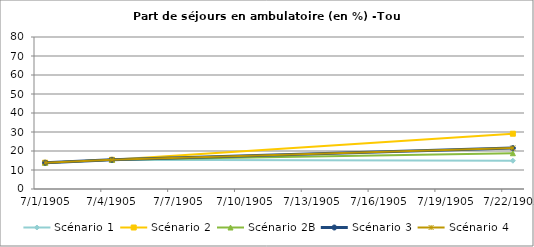
| Category | Scénario 1 | Scénario 2 | Scénario 2B | Scénario 3 | Scénario 4 |
|---|---|---|---|---|---|
| 2009.0 | 13.841 | 13.841 | 13.841 | 13.841 | 13.841 |
| 2012.0 | 15.362 | 15.362 | 15.362 | 15.362 | 15.362 |
| 2030.0 | 14.88 | 29.097 | 18.821 | 21.54 | 21.54 |